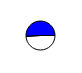
| Category | Series 0 |
|---|---|
| 0 | 5835319 |
| 1 | 6083226 |